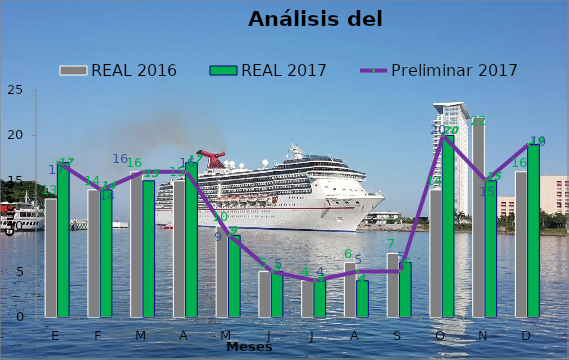
| Category | REAL 2016 | REAL 2017 |
|---|---|---|
| E | 13 | 17 |
| F | 14 | 14 |
| M | 16 | 15 |
| A | 15 | 17 |
| M | 10 | 9 |
| J | 5 | 5 |
| J | 4 | 4 |
| A | 6 | 4 |
| S | 7 | 6 |
| O | 14 | 20 |
| N | 22 | 15 |
| D | 16 | 19 |